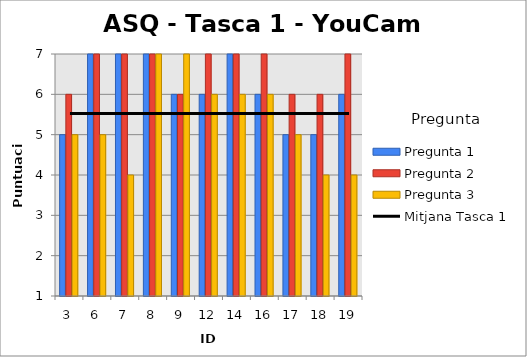
| Category | Pregunta 1 | Pregunta 2 | Pregunta 3 |
|---|---|---|---|
| 3.0 | 5 | 6 | 5 |
| 6.0 | 7 | 7 | 5 |
| 7.0 | 7 | 7 | 4 |
| 8.0 | 7 | 7 | 7 |
| 9.0 | 6 | 6 | 7 |
| 12.0 | 6 | 7 | 6 |
| 14.0 | 7 | 7 | 6 |
| 16.0 | 6 | 7 | 6 |
| 17.0 | 5 | 6 | 5 |
| 18.0 | 5 | 6 | 4 |
| 19.0 | 6 | 7 | 4 |